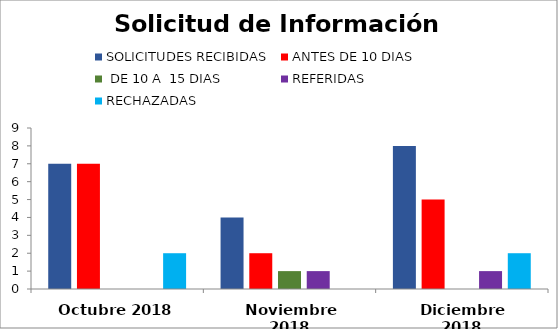
| Category | SOLICITUDES RECIBIDAS | ANTES DE 10 DIAS |  DE 10 A  15 DIAS  | REFERIDAS | RECHAZADAS |
|---|---|---|---|---|---|
| Octubre 2018 | 7 | 7 | 0 | 0 | 2 |
| Noviembre 2018 | 4 | 2 | 1 | 1 | 0 |
| Diciembre 2018 | 8 | 5 | 0 | 1 | 2 |